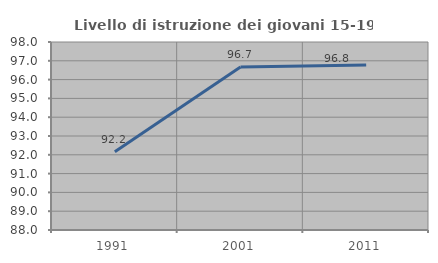
| Category | Livello di istruzione dei giovani 15-19 anni |
|---|---|
| 1991.0 | 92.157 |
| 2001.0 | 96.667 |
| 2011.0 | 96.774 |